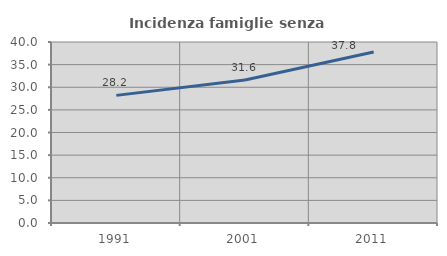
| Category | Incidenza famiglie senza nuclei |
|---|---|
| 1991.0 | 28.205 |
| 2001.0 | 31.599 |
| 2011.0 | 37.782 |